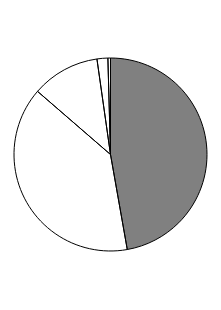
| Category | Series 0 |
|---|---|
| 0 | 47.217 |
| 1 | 39.135 |
| 2 | 11.403 |
| 3 | 1.814 |
| 4 | 0.432 |